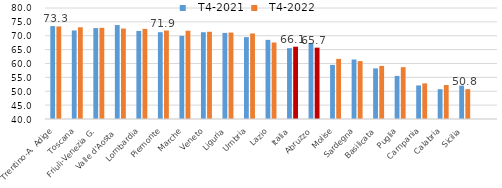
| Category |   T4-2021 |   T4-2022 |
|---|---|---|
|   Trentino-A. Adige | 73.495 | 73.347 |
|   Toscana | 71.91 | 73.037 |
|   Friuli-Venezia G. | 72.759 | 72.869 |
|   Valle d'Aosta  | 73.856 | 72.591 |
|   Lombardia | 71.731 | 72.477 |
|   Piemonte | 71.279 | 71.869 |
|   Marche | 69.95 | 71.817 |
|   Veneto | 71.273 | 71.434 |
|   Liguria | 71.024 | 71.161 |
|   Umbria | 69.504 | 70.815 |
|   Lazio | 68.522 | 67.569 |
| Italia | 65.536 | 66.051 |
|   Abruzzo | 67.38 | 65.714 |
|   Molise | 59.5 | 61.66 |
|   Sardegna | 61.441 | 60.862 |
|   Basilicata | 58.242 | 59.132 |
|   Puglia | 55.537 | 58.678 |
|   Campania | 52.093 | 52.83 |
|   Calabria | 50.744 | 52.239 |
|   Sicilia | 52.023 | 50.755 |